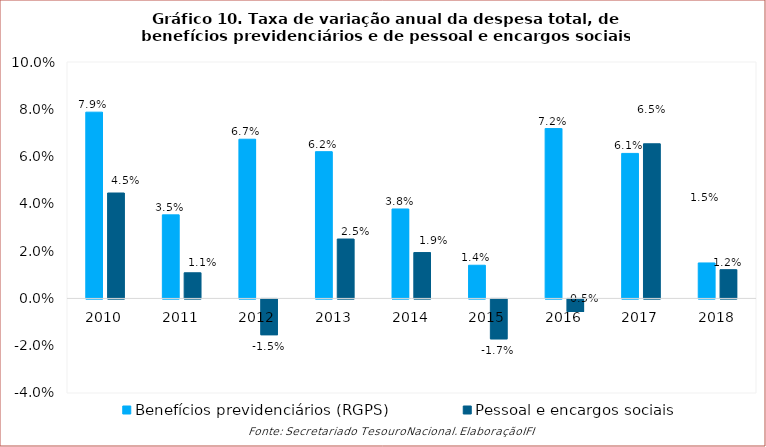
| Category | Benefícios previdenciários (RGPS) | Pessoal e encargos sociais |
|---|---|---|
| 2010.0 | 0.079 | 0.045 |
| 2011.0 | 0.035 | 0.011 |
| 2012.0 | 0.067 | -0.015 |
| 2013.0 | 0.062 | 0.025 |
| 2014.0 | 0.038 | 0.019 |
| 2015.0 | 0.014 | -0.017 |
| 2016.0 | 0.072 | -0.005 |
| 2017.0 | 0.061 | 0.065 |
| 2018.0 | 0.015 | 0.012 |